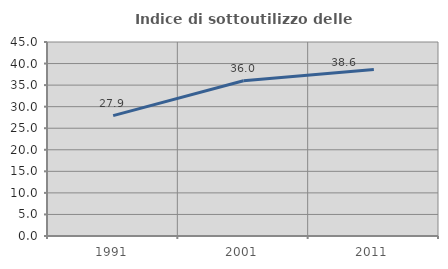
| Category | Indice di sottoutilizzo delle abitazioni  |
|---|---|
| 1991.0 | 27.921 |
| 2001.0 | 36.012 |
| 2011.0 | 38.629 |